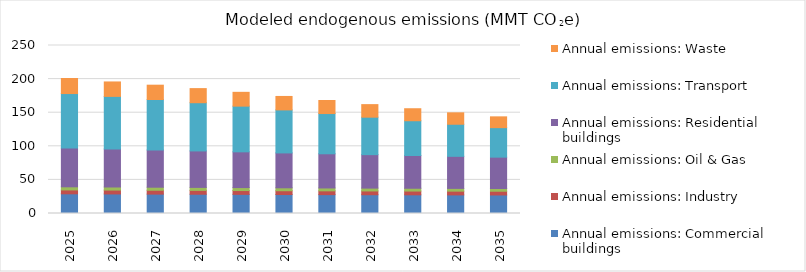
| Category | Annual emissions: Commercial buildings | Annual emissions: Industry | Annual emissions: Oil & Gas | Annual emissions: Residential buildings | Annual emissions: Transport | Annual emissions: Waste |
|---|---|---|---|---|---|---|
| 2025.0 | 29.288 | 5.783 | 4.639 | 57.58 | 81.236 | 22.368 |
| 2026.0 | 29.098 | 5.762 | 4.581 | 56.599 | 78.246 | 21.467 |
| 2027.0 | 28.854 | 5.74 | 4.522 | 55.358 | 75.19 | 21.277 |
| 2028.0 | 28.662 | 5.718 | 4.464 | 54.266 | 71.757 | 20.978 |
| 2029.0 | 28.479 | 5.696 | 4.405 | 53.185 | 67.987 | 20.562 |
| 2030.0 | 28.224 | 5.667 | 4.345 | 51.902 | 64.009 | 20.032 |
| 2031.0 | 28.073 | 5.649 | 4.285 | 50.858 | 59.892 | 19.4 |
| 2032.0 | 27.931 | 5.628 | 4.226 | 49.809 | 55.745 | 18.685 |
| 2033.0 | 27.799 | 5.606 | 4.165 | 48.77 | 51.693 | 17.872 |
| 2034.0 | 27.678 | 5.581 | 4.105 | 47.714 | 47.738 | 16.996 |
| 2035.0 | 27.571 | 5.552 | 4.045 | 46.674 | 43.915 | 16.068 |